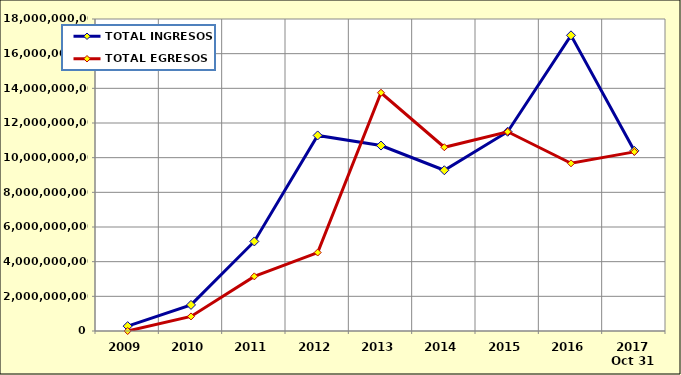
| Category | TOTAL INGRESOS | TOTAL EGRESOS |
|---|---|---|
| 2009 | 280200980 | 0 |
| 2010 | 1504615564.43 | 841833200 |
| 2011 | 5166625386.08 | 3152308640 |
| 2012 | 11282562654.08 | 4526405698 |
| 2013 | 10698538931.11 | 13745049830 |
| 2014 | 9273282656.32 | 10600717391 |
| 2015 | 11495311176.1 | 11493379921 |
| 2016 | 17057308148.41 | 9674526651 |
| 2017 Oct 31 | 10395847117 | 10333107674 |